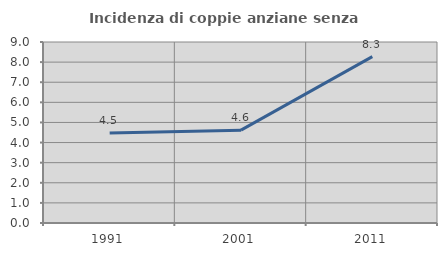
| Category | Incidenza di coppie anziane senza figli  |
|---|---|
| 1991.0 | 4.473 |
| 2001.0 | 4.617 |
| 2011.0 | 8.273 |